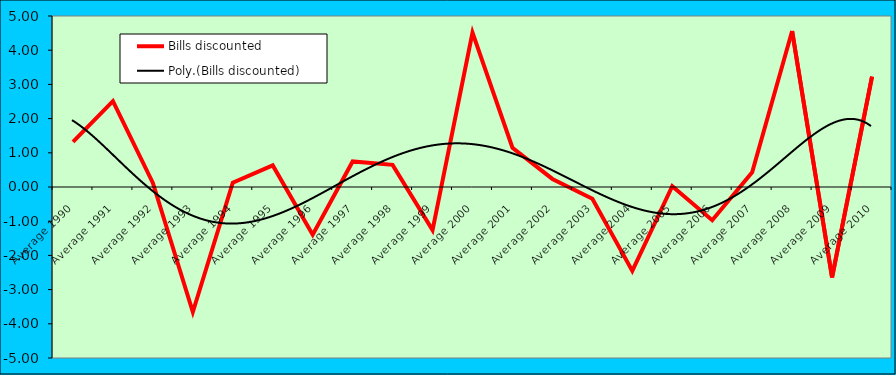
| Category | Bills discounted |
|---|---|
| Average 1990 | 1.317 |
| Average 1991 | 2.509 |
| Average 1992 | 0.118 |
| Average 1993 | -3.657 |
| Average 1994 | 0.125 |
| Average 1995 | 0.632 |
| Average 1996 | -1.397 |
| Average 1997 | 0.747 |
| Average 1998 | 0.647 |
| Average 1999 | -1.26 |
| Average 2000 | 4.514 |
| Average 2001 | 1.148 |
| Average 2002 | 0.236 |
| Average 2003 | -0.341 |
| Average 2004 | -2.452 |
| Average 2005 | 0.023 |
| Average 2006 | -0.971 |
| Average 2007 | 0.427 |
| Average 2008 | 4.562 |
| Average 2009 | -2.646 |
| Average 2010 | 3.225 |